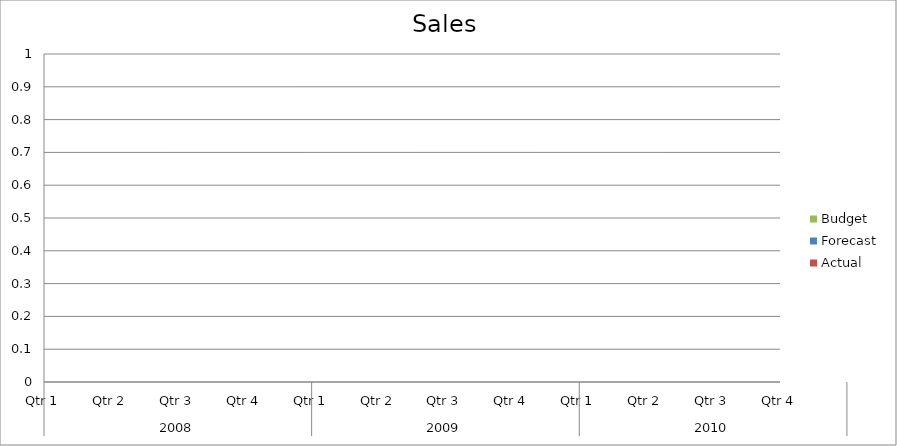
| Category | Budget | Forecast | Actual |
|---|---|---|---|
| 0 | 2750 | 2990 | 940 |
| 1 | 3010 | 2500 | 2290 |
| 2 | 1130 | 670 | 2000 |
| 3 | 1510 | 2600 | 2260 |
| 4 | 650 | 760 | 1710 |
| 5 | 1480 | 2440 | 920 |
| 6 | 1210 | 1470 | 1870 |
| 7 | 1220 | 2400 | 2760 |
| 8 | 1470 | 2430 | 2190 |
| 9 | 830 | 3300 | 510 |
| 10 | 3240 | 2100 | 1620 |
| 11 | 1920 | 3410 | 1400 |